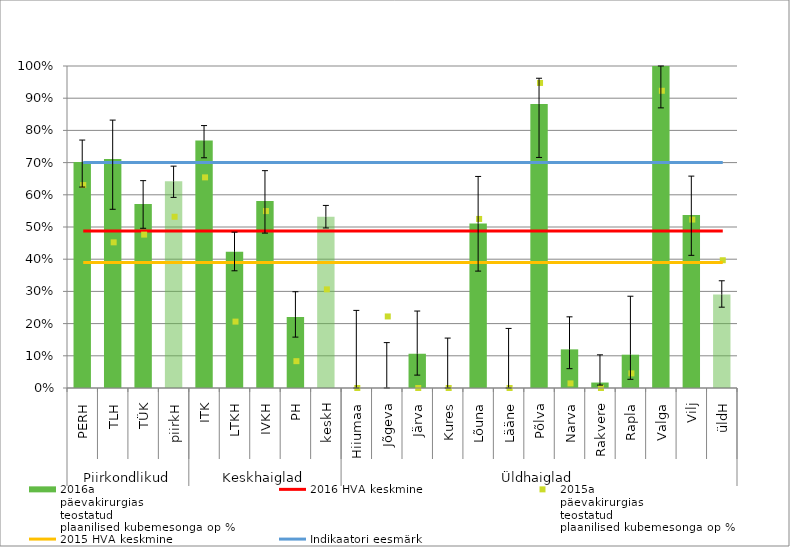
| Category | 2016a
päevakirurgias
teostatud
plaanilised kubemesonga op % |
|---|---|
| 0 | 0.702 |
| 1 | 0.711 |
| 2 | 0.571 |
| 3 | 0.642 |
| 4 | 0.769 |
| 5 | 0.423 |
| 6 | 0.581 |
| 7 | 0.221 |
| 8 | 0.532 |
| 9 | 0 |
| 10 | 0 |
| 11 | 0.106 |
| 12 | 0 |
| 13 | 0.511 |
| 14 | 0 |
| 15 | 0.882 |
| 16 | 0.12 |
| 17 | 0.017 |
| 18 | 0.103 |
| 19 | 1 |
| 20 | 0.537 |
| 21 | 0.29 |